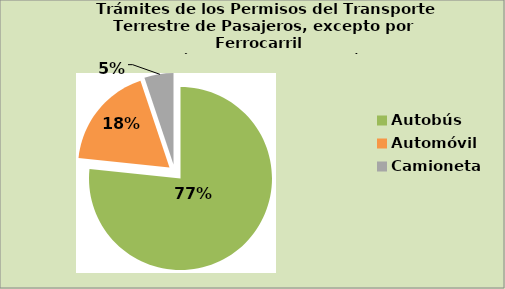
| Category | Series 0 |
|---|---|
| Autobús | 76.617 |
| Automóvil | 18.207 |
| Camioneta | 5.14 |